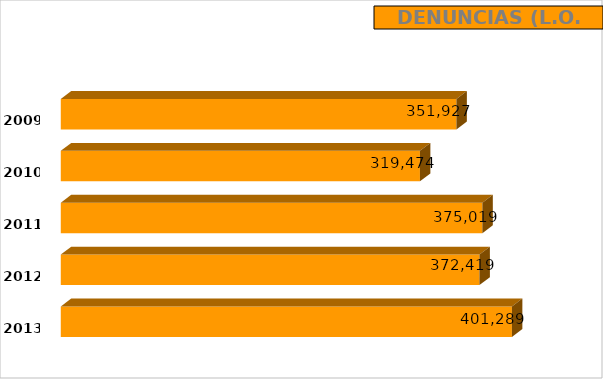
| Category | Denuncias |
|---|---|
| 2009.0 | 351927 |
| 2010.0 | 319474 |
| 2011.0 | 375019 |
| 2012.0 | 372419 |
| 2013.0 | 401289 |